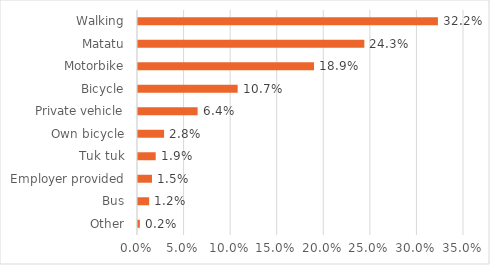
| Category | Series 0 |
|---|---|
| Other | 0.002 |
| Bus | 0.012 |
| Employer provided | 0.015 |
| Tuk tuk | 0.019 |
| Own bicycle | 0.028 |
| Private vehicle | 0.064 |
| Bicycle | 0.107 |
| Motorbike | 0.189 |
| Matatu | 0.243 |
| Walking | 0.322 |